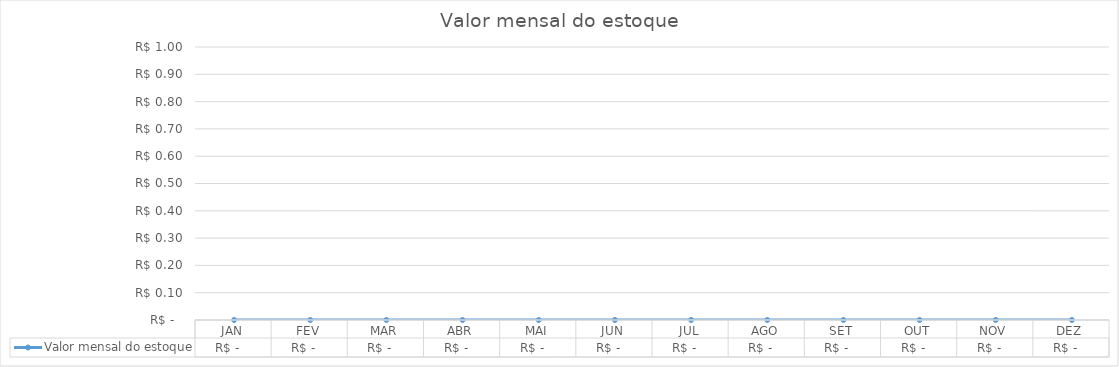
| Category | Valor mensal do estoque |
|---|---|
| JAN | 0 |
| FEV | 0 |
| MAR | 0 |
| ABR | 0 |
| MAI | 0 |
| JUN | 0 |
| JUL | 0 |
| AGO | 0 |
| SET | 0 |
| OUT | 0 |
| NOV | 0 |
| DEZ | 0 |